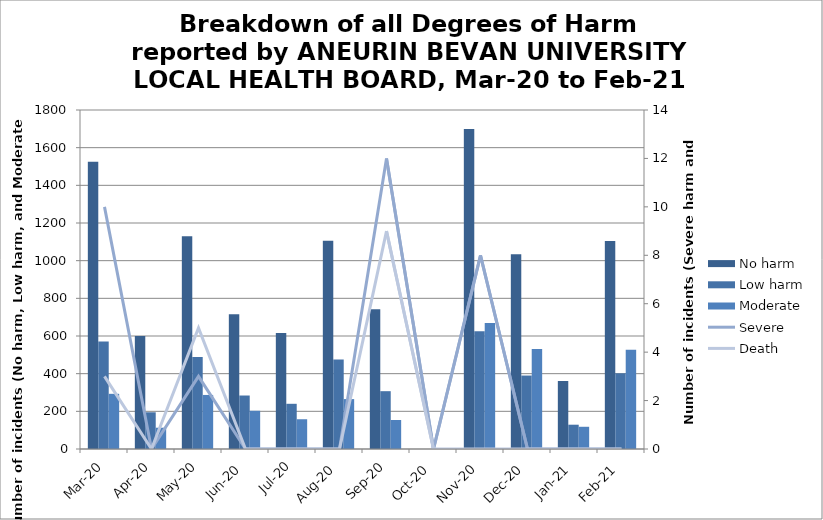
| Category | No harm | Low harm | Moderate |
|---|---|---|---|
| Mar-20 | 1525 | 571 | 293 |
| Apr-20 | 600 | 195 | 113 |
| May-20 | 1129 | 489 | 287 |
| Jun-20 | 715 | 284 | 203 |
| Jul-20 | 616 | 240 | 158 |
| Aug-20 | 1106 | 475 | 265 |
| Sep-20 | 742 | 307 | 154 |
| Oct-20 | 0 | 0 | 0 |
| Nov-20 | 1699 | 625 | 669 |
| Dec-20 | 1034 | 390 | 531 |
| Jan-21 | 361 | 129 | 118 |
| Feb-21 | 1104 | 402 | 527 |